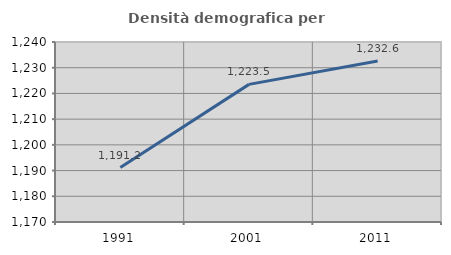
| Category | Densità demografica |
|---|---|
| 1991.0 | 1191.181 |
| 2001.0 | 1223.523 |
| 2011.0 | 1232.613 |